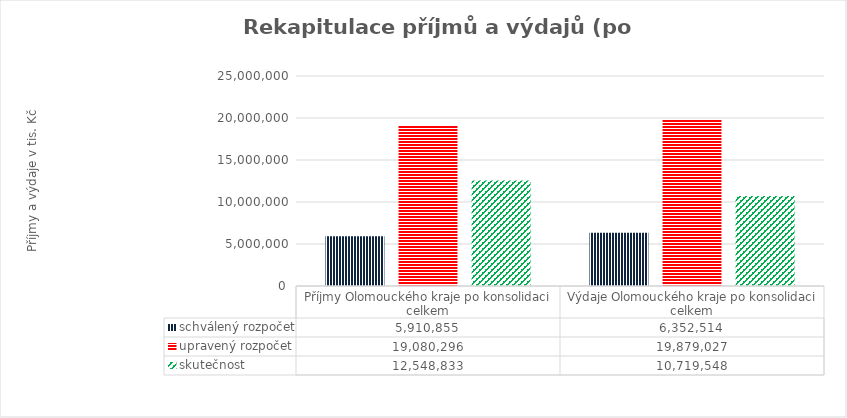
| Category | schválený rozpočet | upravený rozpočet | skutečnost |
|---|---|---|---|
| Příjmy Olomouckého kraje po konsolidaci celkem | 5910855 | 19080296 | 12548833 |
| Výdaje Olomouckého kraje po konsolidaci celkem | 6352514 | 19879027 | 10719548 |